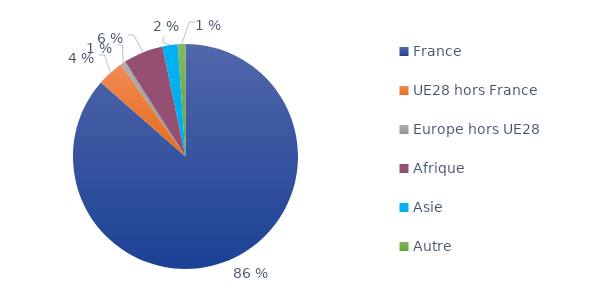
| Category | Series 0 |
|---|---|
| France | 0.864 |
| UE28 hors France | 0.038 |
| Europe hors UE28 | 0.007 |
| Afrique | 0.057 |
| Asie | 0.022 |
| Autre | 0.011 |